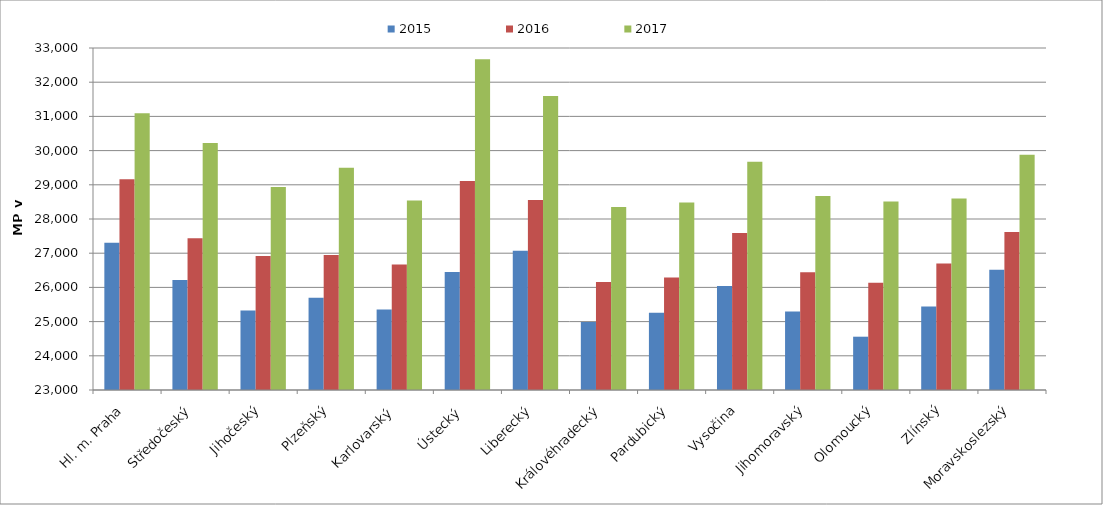
| Category | 2015 | 2016 | 2017 |
|---|---|---|---|
| Hl. m. Praha | 27306.621 | 29162.531 | 31093.346 |
| Středočeský | 26215.797 | 27435.91 | 30219.502 |
| Jihočeský | 25322.533 | 26918.359 | 28934.987 |
| Plzeňský | 25698.012 | 26947.135 | 29500.177 |
| Karlovarský  | 25356.975 | 26672.272 | 28544.129 |
| Ústecký   | 26447.613 | 29114.406 | 32674.003 |
| Liberecký | 27068.26 | 28558.554 | 31595.86 |
| Královéhradecký | 24990.816 | 26154.473 | 28347.63 |
| Pardubický | 25256.889 | 26290.044 | 28480.433 |
| Vysočina | 26043.179 | 27590.257 | 29673.19 |
| Jihomoravský | 25295.507 | 26442.372 | 28669.979 |
| Olomoucký | 24558.461 | 26133.869 | 28511.113 |
| Zlínský | 25440.708 | 26698.87 | 28598.367 |
| Moravskoslezský | 26518.209 | 27616.815 | 29877.656 |